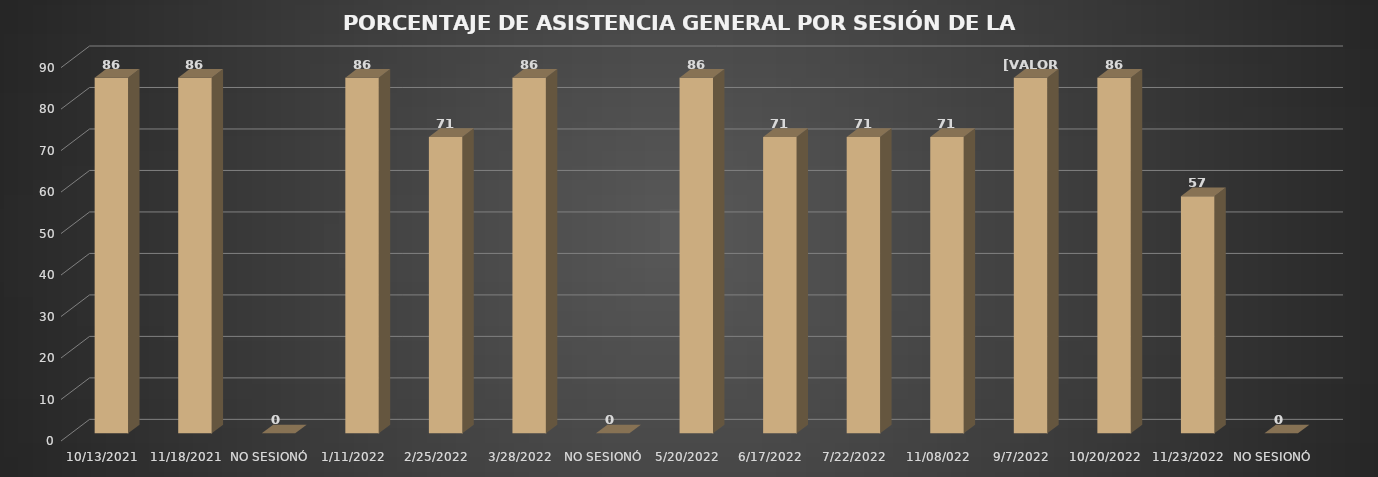
| Category | Series 0 |
|---|---|
| 13/10/2021 | 85.714 |
| 18/11/2021 | 85.714 |
| NO SESIONÓ | 0 |
| 11/01/2022 | 85.714 |
| 25/02/2022 | 71.429 |
| 28/03/2022 | 85.714 |
| NO SESIONÓ | 0 |
| 20/05/2022 | 85.714 |
| 17/06/2022 | 71.429 |
| 22/07/2022 | 71.429 |
| 11/08/022 | 71.429 |
| 07/09/2022 | 85.714 |
| 20/10/2022 | 85.714 |
| 23/11/2022 | 57.143 |
| NO SESIONÓ | 0 |